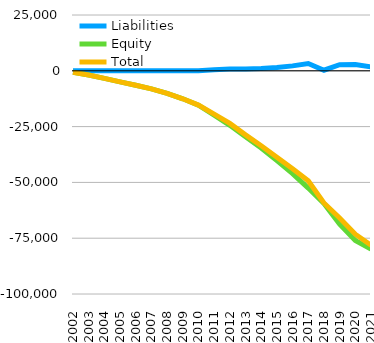
| Category | Liabilities  | Equity  | Total  |
|---|---|---|---|
| 2002 | 0 | -661.7 | -661.7 |
| 2003 | 0 | -1891.7 | -1891.7 |
| 2004 | 0 | -3406.5 | -3406.5 |
| 2005 | 0 | -4936.35 | -4936.35 |
| 2006 | 0 | -6459.35 | -6459.35 |
| 2007 | 0 | -8097.135 | -8097.135 |
| 2008 | 0 | -10092.651 | -10092.651 |
| 2009 | 0 | -12528.651 | -12528.651 |
| 2010 | 0 | -15376.111 | -15376.111 |
| 2011 | 509.16 | -19896.018 | -19386.858 |
| 2012 | 850 | -24433.795 | -23583.795 |
| 2013 | 786.792 | -29492.322 | -28705.53 |
| 2014 | 1057 | -34619.039 | -33562.039 |
| 2015 | 1507 | -40211.371 | -38704.371 |
| 2016 | 2199.97 | -46054.555 | -43854.585 |
| 2017 | 3256.97 | -52548.6 | -49291.63 |
| 2018 | 266.97 | -59474.801 | -59207.831 |
| 2019 | 2726.97 | -68651.218 | -65924.248 |
| 2020 | 2821.97 | -76022.287 | -73200.317 |
| 2021 | 1706.97 | -79849.745 | -78142.775 |